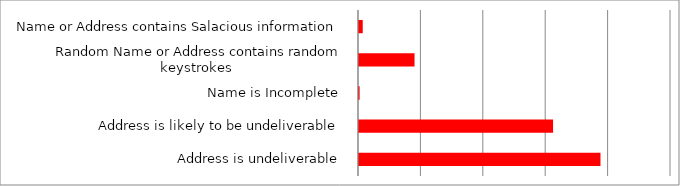
| Category | Series 0 |
|---|---|
|  Name or Address contains Salacious information  | 6 |
|  Random Name or Address contains random keystrokes  | 89 |
|  Name is Incomplete  | 1 |
|  Address is likely to be undeliverable  | 311 |
|  Address is undeliverable  | 387 |